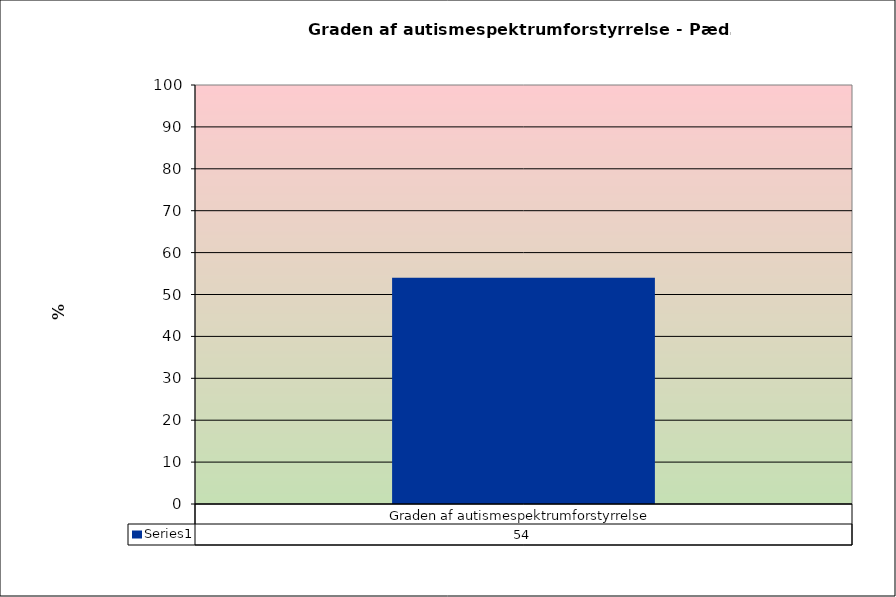
| Category | Series 0 |
|---|---|
| Graden af autismespektrumforstyrrelse | 54 |